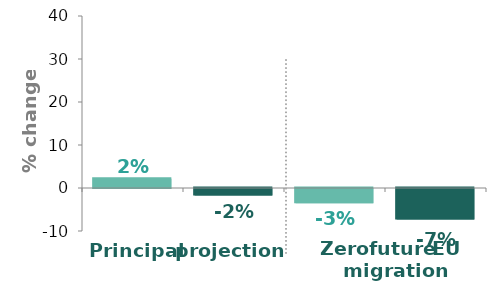
| Category | Series 0 |
|---|---|
| UK principal projection | 2.133 |
| Scotland principal projection | -1.523 |
| UK Zero future EU migration variant | -3.34 |
| Scotland Zero future EU migration variant | -7.088 |